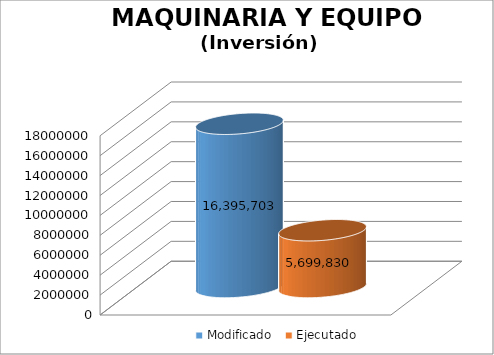
| Category | Modificado | Ejecutado |
|---|---|---|
| 0 | 16395703 | 5699829.66 |